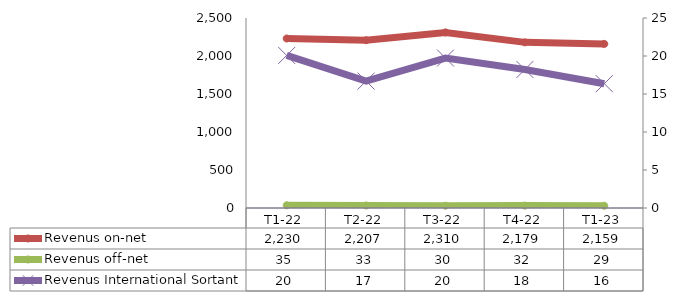
| Category | Revenus on-net | Revenus off-net |
|---|---|---|
| T1-22 | 2230.235 | 35.375 |
| T2-22 | 2207.488 | 33.03 |
| T3-22 | 2310.244 | 29.718 |
| T4-22 | 2179.348 | 31.597 |
| T1-23 | 2159.381 | 29.449 |